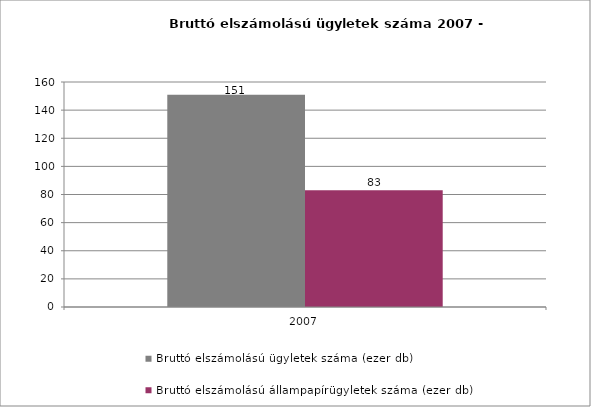
| Category | Bruttó elszámolású ügyletek száma (ezer db) | Bruttó elszámolású állampapírügyletek száma (ezer db) |
|---|---|---|
| 2007.0 | 151 | 83 |